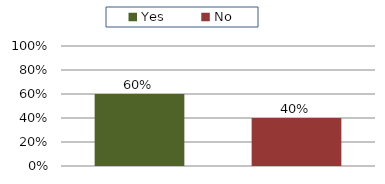
| Category | Total |
|---|---|
| Yes | 0.6 |
| No | 0.4 |